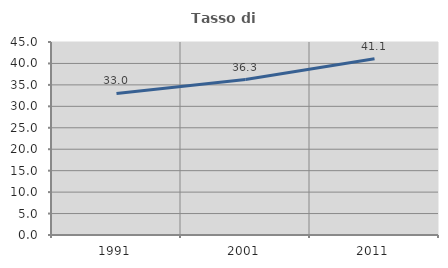
| Category | Tasso di occupazione   |
|---|---|
| 1991.0 | 33.014 |
| 2001.0 | 36.252 |
| 2011.0 | 41.076 |